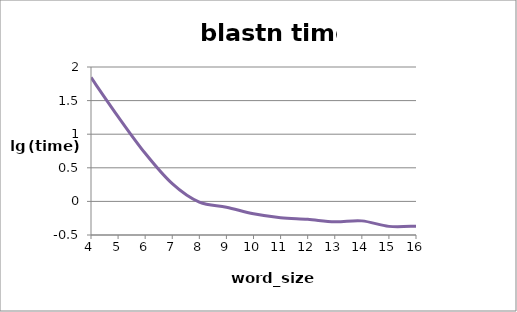
| Category | Series 0 |
|---|---|
| 4.0 | 1.844 |
| 5.0 | 1.262 |
| 6.0 | 0.716 |
| 7.0 | 0.263 |
| 8.0 | -0.012 |
| 9.0 | -0.086 |
| 10.0 | -0.183 |
| 11.0 | -0.242 |
| 12.0 | -0.267 |
| 13.0 | -0.303 |
| 14.0 | -0.29 |
| 15.0 | -0.372 |
| 16.0 | -0.369 |